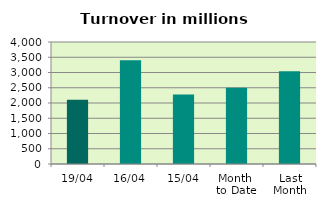
| Category | Series 0 |
|---|---|
| 19/04 | 2105.185 |
| 16/04 | 3400.589 |
| 15/04 | 2280.97 |
| Month 
to Date | 2503.521 |
| Last
Month | 3040.277 |